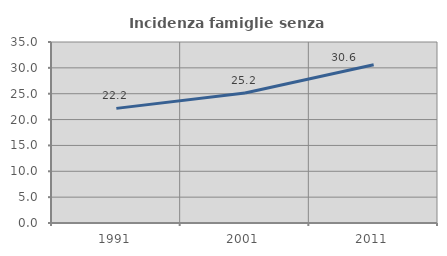
| Category | Incidenza famiglie senza nuclei |
|---|---|
| 1991.0 | 22.164 |
| 2001.0 | 25.154 |
| 2011.0 | 30.617 |